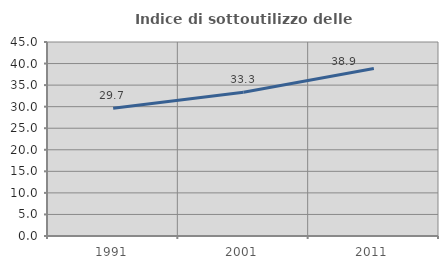
| Category | Indice di sottoutilizzo delle abitazioni  |
|---|---|
| 1991.0 | 29.653 |
| 2001.0 | 33.333 |
| 2011.0 | 38.863 |